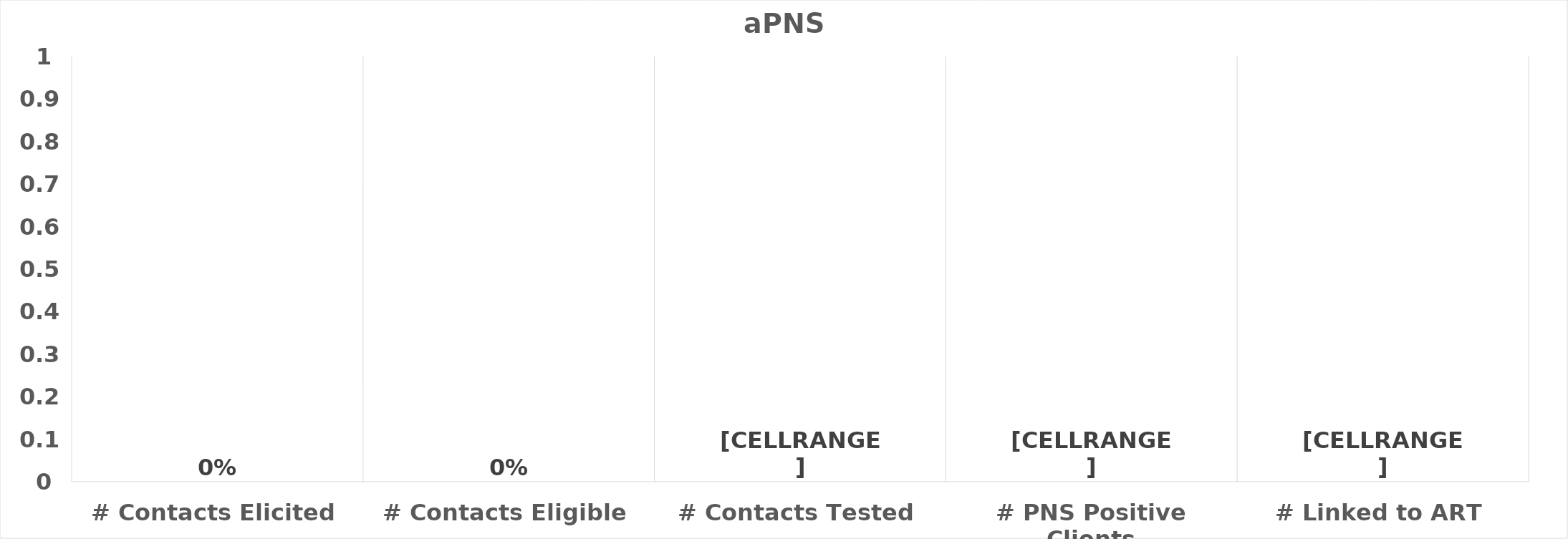
| Category | Results Achieved |
|---|---|
| # Contacts Elicited | 0 |
| # Contacts Eligible | 0 |
| # Contacts Tested | 0 |
| # PNS Positive Clients | 0 |
| # Linked to ART | 0 |